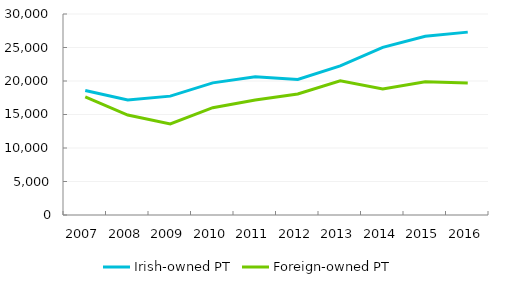
| Category | Irish-owned PT | Foreign-owned PT  |
|---|---|---|
| 2007.0 | 18570 | 17626 |
| 2008.0 | 17166 | 14914 |
| 2009.0 | 17741 | 13586 |
| 2010.0 | 19724 | 16014 |
| 2011.0 | 20636 | 17150 |
| 2012.0 | 20229 | 18070 |
| 2013.0 | 22249 | 20015 |
| 2014.0 | 25018 | 18812 |
| 2015.0 | 26680 | 19887 |
| 2016.0 | 27294 | 19703 |